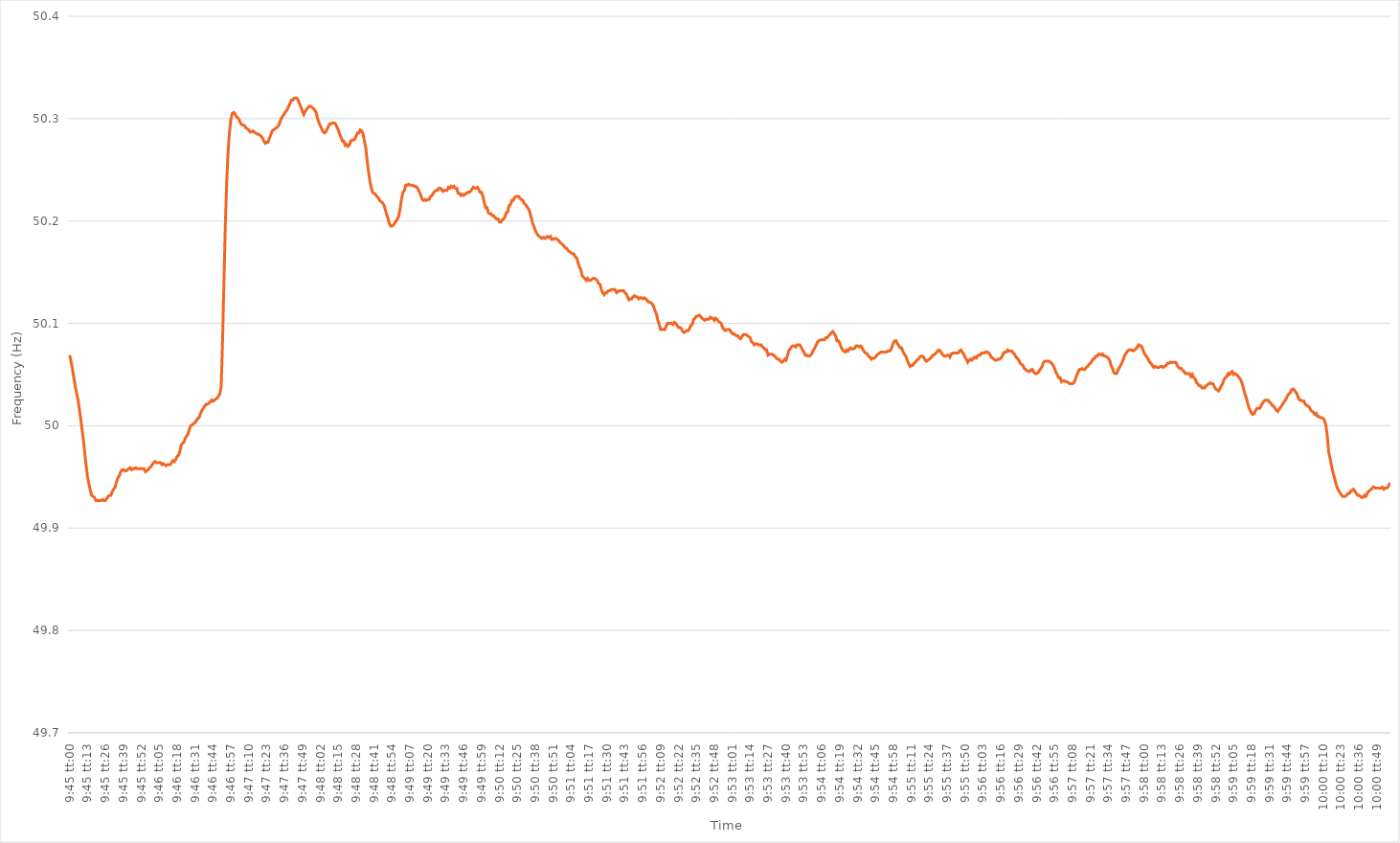
| Category | Series 0 |
|---|---|
| 0.40625 | 50.069 |
| 0.40626157407407404 | 50.063 |
| 0.40627314814814813 | 50.056 |
| 0.40628472222222217 | 50.047 |
| 0.4062962962962963 | 50.039 |
| 0.40630787037037036 | 50.032 |
| 0.40631944444444446 | 50.026 |
| 0.4063310185185185 | 50.017 |
| 0.4063425925925926 | 50.007 |
| 0.4063541666666666 | 49.997 |
| 0.4063657407407408 | 49.986 |
| 0.4063773148148148 | 49.973 |
| 0.4063888888888889 | 49.961 |
| 0.40640046296296295 | 49.95 |
| 0.40641203703703704 | 49.943 |
| 0.4064236111111111 | 49.937 |
| 0.40643518518518523 | 49.932 |
| 0.40644675925925927 | 49.931 |
| 0.40645833333333337 | 49.93 |
| 0.4064699074074074 | 49.927 |
| 0.4064814814814815 | 49.927 |
| 0.40649305555555554 | 49.927 |
| 0.4065046296296296 | 49.927 |
| 0.4065162037037037 | 49.927 |
| 0.40652777777777777 | 49.928 |
| 0.40653935185185186 | 49.927 |
| 0.4065509259259259 | 49.927 |
| 0.4065625 | 49.929 |
| 0.40657407407407403 | 49.931 |
| 0.4065856481481482 | 49.932 |
| 0.4065972222222222 | 49.932 |
| 0.4066087962962963 | 49.936 |
| 0.40662037037037035 | 49.938 |
| 0.40663194444444445 | 49.94 |
| 0.4066435185185185 | 49.945 |
| 0.40665509259259264 | 49.949 |
| 0.4066666666666667 | 49.951 |
| 0.40667824074074077 | 49.955 |
| 0.4066898148148148 | 49.957 |
| 0.4067013888888889 | 49.957 |
| 0.40671296296296294 | 49.956 |
| 0.406724537037037 | 49.956 |
| 0.40673611111111113 | 49.957 |
| 0.40674768518518517 | 49.958 |
| 0.40675925925925926 | 49.959 |
| 0.4067708333333333 | 49.957 |
| 0.4067824074074074 | 49.958 |
| 0.40679398148148144 | 49.958 |
| 0.4068055555555556 | 49.959 |
| 0.4068171296296296 | 49.958 |
| 0.4068287037037037 | 49.958 |
| 0.40684027777777776 | 49.958 |
| 0.40685185185185185 | 49.958 |
| 0.4068634259259259 | 49.958 |
| 0.40687500000000004 | 49.958 |
| 0.4068865740740741 | 49.955 |
| 0.4068981481481482 | 49.956 |
| 0.4069097222222222 | 49.957 |
| 0.4069212962962963 | 49.959 |
| 0.40693287037037035 | 49.96 |
| 0.4069444444444445 | 49.962 |
| 0.40695601851851854 | 49.964 |
| 0.4069675925925926 | 49.965 |
| 0.40697916666666667 | 49.964 |
| 0.4069907407407407 | 49.964 |
| 0.4070023148148148 | 49.964 |
| 0.40701388888888884 | 49.964 |
| 0.407025462962963 | 49.962 |
| 0.40703703703703703 | 49.963 |
| 0.4070486111111111 | 49.962 |
| 0.40706018518518516 | 49.961 |
| 0.40707175925925926 | 49.962 |
| 0.4070833333333333 | 49.962 |
| 0.40709490740740745 | 49.962 |
| 0.4071064814814815 | 49.964 |
| 0.4071180555555556 | 49.966 |
| 0.4071296296296296 | 49.965 |
| 0.4071412037037037 | 49.967 |
| 0.40715277777777775 | 49.97 |
| 0.4071643518518519 | 49.971 |
| 0.40717592592592594 | 49.975 |
| 0.40718750000000004 | 49.981 |
| 0.4071990740740741 | 49.983 |
| 0.4072106481481481 | 49.984 |
| 0.4072222222222222 | 49.988 |
| 0.40723379629629625 | 49.99 |
| 0.4072453703703704 | 49.992 |
| 0.40725694444444444 | 49.997 |
| 0.40726851851851853 | 50 |
| 0.40728009259259257 | 50.001 |
| 0.40729166666666666 | 50.002 |
| 0.4073032407407407 | 50.003 |
| 0.40731481481481485 | 50.005 |
| 0.4073263888888889 | 50.007 |
| 0.407337962962963 | 50.008 |
| 0.407349537037037 | 50.012 |
| 0.4073611111111111 | 50.015 |
| 0.40737268518518516 | 50.017 |
| 0.4073842592592593 | 50.019 |
| 0.40739583333333335 | 50.021 |
| 0.40740740740740744 | 50.021 |
| 0.4074189814814815 | 50.022 |
| 0.4074305555555556 | 50.023 |
| 0.4074421296296296 | 50.025 |
| 0.40745370370370365 | 50.024 |
| 0.4074652777777778 | 50.025 |
| 0.40747685185185184 | 50.026 |
| 0.40748842592592593 | 50.027 |
| 0.4075 | 50.029 |
| 0.40751157407407407 | 50.031 |
| 0.4075231481481481 | 50.038 |
| 0.40753472222222226 | 50.082 |
| 0.4075462962962963 | 50.14 |
| 0.4075578703703704 | 50.195 |
| 0.40756944444444443 | 50.237 |
| 0.4075810185185185 | 50.267 |
| 0.40759259259259256 | 50.286 |
| 0.4076041666666667 | 50.299 |
| 0.40761574074074075 | 50.305 |
| 0.40762731481481485 | 50.306 |
| 0.4076388888888889 | 50.305 |
| 0.407650462962963 | 50.302 |
| 0.407662037037037 | 50.301 |
| 0.40767361111111106 | 50.299 |
| 0.4076851851851852 | 50.296 |
| 0.40769675925925924 | 50.294 |
| 0.40770833333333334 | 50.294 |
| 0.4077199074074074 | 50.293 |
| 0.4077314814814815 | 50.291 |
| 0.4077430555555555 | 50.29 |
| 0.40775462962962966 | 50.289 |
| 0.4077662037037037 | 50.287 |
| 0.4077777777777778 | 50.287 |
| 0.40778935185185183 | 50.288 |
| 0.40780092592592593 | 50.287 |
| 0.40781249999999997 | 50.286 |
| 0.4078240740740741 | 50.285 |
| 0.40783564814814816 | 50.285 |
| 0.40784722222222225 | 50.284 |
| 0.4078587962962963 | 50.283 |
| 0.4078703703703704 | 50.281 |
| 0.4078819444444444 | 50.278 |
| 0.40789351851851857 | 50.276 |
| 0.4079050925925926 | 50.277 |
| 0.40791666666666665 | 50.277 |
| 0.40792824074074074 | 50.281 |
| 0.4079398148148148 | 50.284 |
| 0.4079513888888889 | 50.288 |
| 0.4079629629629629 | 50.289 |
| 0.40797453703703707 | 50.29 |
| 0.4079861111111111 | 50.291 |
| 0.4079976851851852 | 50.292 |
| 0.40800925925925924 | 50.294 |
| 0.40802083333333333 | 50.298 |
| 0.40803240740740737 | 50.301 |
| 0.4080439814814815 | 50.303 |
| 0.40805555555555556 | 50.305 |
| 0.40806712962962965 | 50.307 |
| 0.4080787037037037 | 50.309 |
| 0.4080902777777778 | 50.312 |
| 0.4081018518518518 | 50.315 |
| 0.408113425925926 | 50.318 |
| 0.408125 | 50.318 |
| 0.4081365740740741 | 50.32 |
| 0.40814814814814815 | 50.32 |
| 0.4081597222222222 | 50.32 |
| 0.4081712962962963 | 50.318 |
| 0.4081828703703703 | 50.314 |
| 0.40819444444444447 | 50.311 |
| 0.4082060185185185 | 50.307 |
| 0.4082175925925926 | 50.304 |
| 0.40822916666666664 | 50.307 |
| 0.40824074074074074 | 50.309 |
| 0.4082523148148148 | 50.311 |
| 0.4082638888888889 | 50.312 |
| 0.40827546296296297 | 50.312 |
| 0.40828703703703706 | 50.311 |
| 0.4082986111111111 | 50.31 |
| 0.4083101851851852 | 50.308 |
| 0.40832175925925923 | 50.306 |
| 0.4083333333333334 | 50.3 |
| 0.4083449074074074 | 50.296 |
| 0.4083564814814815 | 50.293 |
| 0.40836805555555555 | 50.29 |
| 0.40837962962962965 | 50.287 |
| 0.4083912037037037 | 50.286 |
| 0.4084027777777777 | 50.287 |
| 0.4084143518518519 | 50.29 |
| 0.4084259259259259 | 50.293 |
| 0.4084375 | 50.295 |
| 0.40844907407407405 | 50.295 |
| 0.40846064814814814 | 50.296 |
| 0.4084722222222222 | 50.296 |
| 0.40848379629629633 | 50.295 |
| 0.40849537037037037 | 50.292 |
| 0.40850694444444446 | 50.289 |
| 0.4085185185185185 | 50.285 |
| 0.4085300925925926 | 50.282 |
| 0.40854166666666664 | 50.278 |
| 0.4085532407407408 | 50.278 |
| 0.4085648148148148 | 50.274 |
| 0.4085763888888889 | 50.275 |
| 0.40858796296296296 | 50.273 |
| 0.40859953703703705 | 50.274 |
| 0.4086111111111111 | 50.278 |
| 0.40862268518518513 | 50.279 |
| 0.4086342592592593 | 50.279 |
| 0.4086458333333333 | 50.28 |
| 0.4086574074074074 | 50.283 |
| 0.40866898148148145 | 50.286 |
| 0.40868055555555555 | 50.286 |
| 0.4086921296296296 | 50.289 |
| 0.40870370370370374 | 50.288 |
| 0.4087152777777778 | 50.285 |
| 0.40872685185185187 | 50.278 |
| 0.4087384259259259 | 50.271 |
| 0.40875 | 50.259 |
| 0.40876157407407404 | 50.248 |
| 0.4087731481481482 | 50.239 |
| 0.40878472222222223 | 50.232 |
| 0.4087962962962963 | 50.228 |
| 0.40880787037037036 | 50.227 |
| 0.40881944444444446 | 50.226 |
| 0.4088310185185185 | 50.224 |
| 0.40884259259259265 | 50.223 |
| 0.4088541666666667 | 50.22 |
| 0.4088657407407407 | 50.219 |
| 0.4088773148148148 | 50.218 |
| 0.40888888888888886 | 50.216 |
| 0.40890046296296295 | 50.212 |
| 0.408912037037037 | 50.207 |
| 0.40892361111111114 | 50.203 |
| 0.4089351851851852 | 50.198 |
| 0.4089467592592593 | 50.195 |
| 0.4089583333333333 | 50.195 |
| 0.4089699074074074 | 50.196 |
| 0.40898148148148145 | 50.198 |
| 0.4089930555555556 | 50.2 |
| 0.40900462962962963 | 50.202 |
| 0.40901620370370373 | 50.205 |
| 0.40902777777777777 | 50.213 |
| 0.40903935185185186 | 50.222 |
| 0.4090509259259259 | 50.228 |
| 0.40906250000000005 | 50.23 |
| 0.4090740740740741 | 50.235 |
| 0.4090856481481482 | 50.235 |
| 0.4090972222222222 | 50.236 |
| 0.40910879629629626 | 50.235 |
| 0.40912037037037036 | 50.235 |
| 0.4091319444444444 | 50.235 |
| 0.40914351851851855 | 50.234 |
| 0.4091550925925926 | 50.234 |
| 0.4091666666666667 | 50.233 |
| 0.4091782407407407 | 50.231 |
| 0.4091898148148148 | 50.228 |
| 0.40920138888888885 | 50.225 |
| 0.409212962962963 | 50.221 |
| 0.40922453703703704 | 50.22 |
| 0.40923611111111113 | 50.221 |
| 0.4092476851851852 | 50.22 |
| 0.40925925925925927 | 50.221 |
| 0.4092708333333333 | 50.221 |
| 0.40928240740740746 | 50.224 |
| 0.4092939814814815 | 50.225 |
| 0.4093055555555556 | 50.227 |
| 0.40931712962962963 | 50.229 |
| 0.40932870370370367 | 50.23 |
| 0.40934027777777776 | 50.23 |
| 0.4093518518518518 | 50.232 |
| 0.40936342592592595 | 50.232 |
| 0.409375 | 50.231 |
| 0.4093865740740741 | 50.229 |
| 0.4093981481481481 | 50.23 |
| 0.4094097222222222 | 50.23 |
| 0.40942129629629626 | 50.23 |
| 0.4094328703703704 | 50.233 |
| 0.40944444444444444 | 50.232 |
| 0.40945601851851854 | 50.234 |
| 0.4094675925925926 | 50.233 |
| 0.40947916666666667 | 50.234 |
| 0.4094907407407407 | 50.232 |
| 0.40950231481481486 | 50.232 |
| 0.4095138888888889 | 50.227 |
| 0.409525462962963 | 50.227 |
| 0.40953703703703703 | 50.225 |
| 0.4095486111111111 | 50.226 |
| 0.40956018518518517 | 50.225 |
| 0.4095717592592592 | 50.226 |
| 0.40958333333333335 | 50.227 |
| 0.4095949074074074 | 50.228 |
| 0.4096064814814815 | 50.228 |
| 0.4096180555555555 | 50.229 |
| 0.4096296296296296 | 50.231 |
| 0.40964120370370366 | 50.233 |
| 0.4096527777777778 | 50.232 |
| 0.40966435185185185 | 50.232 |
| 0.40967592592592594 | 50.233 |
| 0.4096875 | 50.231 |
| 0.4096990740740741 | 50.228 |
| 0.4097106481481481 | 50.228 |
| 0.40972222222222227 | 50.224 |
| 0.4097337962962963 | 50.218 |
| 0.4097453703703704 | 50.213 |
| 0.40975694444444444 | 50.213 |
| 0.40976851851851853 | 50.208 |
| 0.40978009259259257 | 50.207 |
| 0.4097916666666667 | 50.207 |
| 0.40980324074074076 | 50.205 |
| 0.4098148148148148 | 50.205 |
| 0.4098263888888889 | 50.203 |
| 0.40983796296296293 | 50.202 |
| 0.409849537037037 | 50.202 |
| 0.40986111111111106 | 50.199 |
| 0.4098726851851852 | 50.199 |
| 0.40988425925925925 | 50.201 |
| 0.40989583333333335 | 50.202 |
| 0.4099074074074074 | 50.204 |
| 0.4099189814814815 | 50.208 |
| 0.4099305555555555 | 50.209 |
| 0.40994212962962967 | 50.215 |
| 0.4099537037037037 | 50.216 |
| 0.4099652777777778 | 50.22 |
| 0.40997685185185184 | 50.22 |
| 0.40998842592592594 | 50.223 |
| 0.41 | 50.224 |
| 0.4100115740740741 | 50.224 |
| 0.41002314814814816 | 50.224 |
| 0.41003472222222226 | 50.222 |
| 0.4100462962962963 | 50.221 |
| 0.41005787037037034 | 50.22 |
| 0.41006944444444443 | 50.217 |
| 0.41008101851851847 | 50.216 |
| 0.4100925925925926 | 50.214 |
| 0.41010416666666666 | 50.212 |
| 0.41011574074074075 | 50.209 |
| 0.4101273148148148 | 50.204 |
| 0.4101388888888889 | 50.198 |
| 0.4101504629629629 | 50.195 |
| 0.4101620370370371 | 50.191 |
| 0.4101736111111111 | 50.188 |
| 0.4101851851851852 | 50.186 |
| 0.41019675925925925 | 50.185 |
| 0.41020833333333334 | 50.184 |
| 0.4102199074074074 | 50.183 |
| 0.41023148148148153 | 50.184 |
| 0.41024305555555557 | 50.183 |
| 0.41025462962962966 | 50.184 |
| 0.4102662037037037 | 50.185 |
| 0.41027777777777774 | 50.184 |
| 0.41028935185185184 | 50.185 |
| 0.4103009259259259 | 50.182 |
| 0.4103125 | 50.182 |
| 0.41032407407407406 | 50.183 |
| 0.41033564814814816 | 50.183 |
| 0.4103472222222222 | 50.182 |
| 0.4103587962962963 | 50.181 |
| 0.41037037037037033 | 50.179 |
| 0.4103819444444445 | 50.178 |
| 0.4103935185185185 | 50.177 |
| 0.4104050925925926 | 50.175 |
| 0.41041666666666665 | 50.174 |
| 0.41042824074074075 | 50.173 |
| 0.4104398148148148 | 50.171 |
| 0.41045138888888894 | 50.17 |
| 0.410462962962963 | 50.169 |
| 0.41047453703703707 | 50.168 |
| 0.4104861111111111 | 50.168 |
| 0.4104976851851852 | 50.165 |
| 0.41050925925925924 | 50.164 |
| 0.4105208333333333 | 50.16 |
| 0.41053240740740743 | 50.155 |
| 0.41054398148148147 | 50.153 |
| 0.41055555555555556 | 50.147 |
| 0.4105671296296296 | 50.145 |
| 0.4105787037037037 | 50.144 |
| 0.41059027777777773 | 50.142 |
| 0.4106018518518519 | 50.144 |
| 0.4106134259259259 | 50.142 |
| 0.410625 | 50.142 |
| 0.41063657407407406 | 50.143 |
| 0.41064814814814815 | 50.144 |
| 0.4106597222222222 | 50.144 |
| 0.41067129629629634 | 50.143 |
| 0.4106828703703704 | 50.142 |
| 0.4106944444444445 | 50.139 |
| 0.4107060185185185 | 50.138 |
| 0.4107175925925926 | 50.133 |
| 0.41072916666666665 | 50.13 |
| 0.4107407407407408 | 50.128 |
| 0.41075231481481483 | 50.13 |
| 0.4107638888888889 | 50.13 |
| 0.41077546296296297 | 50.132 |
| 0.410787037037037 | 50.132 |
| 0.4107986111111111 | 50.133 |
| 0.41081018518518514 | 50.133 |
| 0.4108217592592593 | 50.133 |
| 0.41083333333333333 | 50.133 |
| 0.4108449074074074 | 50.13 |
| 0.41085648148148146 | 50.131 |
| 0.41086805555555556 | 50.132 |
| 0.4108796296296296 | 50.132 |
| 0.41089120370370374 | 50.132 |
| 0.4109027777777778 | 50.132 |
| 0.4109143518518519 | 50.13 |
| 0.4109259259259259 | 50.129 |
| 0.4109375 | 50.126 |
| 0.41094907407407405 | 50.123 |
| 0.4109606481481482 | 50.124 |
| 0.41097222222222224 | 50.124 |
| 0.41098379629629633 | 50.126 |
| 0.41099537037037037 | 50.127 |
| 0.4110069444444444 | 50.126 |
| 0.4110185185185185 | 50.126 |
| 0.41103009259259254 | 50.124 |
| 0.4110416666666667 | 50.125 |
| 0.41105324074074073 | 50.125 |
| 0.4110648148148148 | 50.124 |
| 0.41107638888888887 | 50.125 |
| 0.41108796296296296 | 50.124 |
| 0.411099537037037 | 50.123 |
| 0.41111111111111115 | 50.121 |
| 0.4111226851851852 | 50.121 |
| 0.4111342592592593 | 50.12 |
| 0.4111458333333333 | 50.119 |
| 0.4111574074074074 | 50.116 |
| 0.41116898148148145 | 50.112 |
| 0.4111805555555556 | 50.109 |
| 0.41119212962962964 | 50.103 |
| 0.41120370370370374 | 50.099 |
| 0.4112152777777778 | 50.094 |
| 0.4112268518518518 | 50.094 |
| 0.4112384259259259 | 50.094 |
| 0.41124999999999995 | 50.094 |
| 0.4112615740740741 | 50.097 |
| 0.41127314814814814 | 50.1 |
| 0.41128472222222223 | 50.1 |
| 0.41129629629629627 | 50.1 |
| 0.41130787037037037 | 50.1 |
| 0.4113194444444444 | 50.099 |
| 0.41133101851851855 | 50.101 |
| 0.4113425925925926 | 50.1 |
| 0.4113541666666667 | 50.098 |
| 0.4113657407407407 | 50.096 |
| 0.4113773148148148 | 50.096 |
| 0.41138888888888886 | 50.095 |
| 0.411400462962963 | 50.092 |
| 0.41141203703703705 | 50.091 |
| 0.41142361111111114 | 50.092 |
| 0.4114351851851852 | 50.093 |
| 0.4114467592592593 | 50.093 |
| 0.4114583333333333 | 50.095 |
| 0.41146990740740735 | 50.098 |
| 0.4114814814814815 | 50.099 |
| 0.41149305555555554 | 50.104 |
| 0.41150462962962964 | 50.105 |
| 0.4115162037037037 | 50.107 |
| 0.41152777777777777 | 50.107 |
| 0.4115393518518518 | 50.108 |
| 0.41155092592592596 | 50.107 |
| 0.4115625 | 50.105 |
| 0.4115740740740741 | 50.104 |
| 0.41158564814814813 | 50.103 |
| 0.4115972222222222 | 50.104 |
| 0.41160879629629626 | 50.104 |
| 0.4116203703703704 | 50.104 |
| 0.41163194444444445 | 50.106 |
| 0.41164351851851855 | 50.105 |
| 0.4116550925925926 | 50.105 |
| 0.4116666666666667 | 50.103 |
| 0.4116782407407407 | 50.105 |
| 0.41168981481481487 | 50.104 |
| 0.4117013888888889 | 50.102 |
| 0.41171296296296295 | 50.101 |
| 0.41172453703703704 | 50.1 |
| 0.4117361111111111 | 50.096 |
| 0.4117476851851852 | 50.094 |
| 0.4117592592592592 | 50.093 |
| 0.41177083333333336 | 50.094 |
| 0.4117824074074074 | 50.094 |
| 0.4117939814814815 | 50.094 |
| 0.41180555555555554 | 50.092 |
| 0.41181712962962963 | 50.09 |
| 0.41182870370370367 | 50.09 |
| 0.4118402777777778 | 50.089 |
| 0.41185185185185186 | 50.088 |
| 0.41186342592592595 | 50.088 |
| 0.411875 | 50.086 |
| 0.4118865740740741 | 50.085 |
| 0.4118981481481481 | 50.087 |
| 0.4119097222222223 | 50.089 |
| 0.4119212962962963 | 50.089 |
| 0.41193287037037035 | 50.089 |
| 0.41194444444444445 | 50.088 |
| 0.4119560185185185 | 50.087 |
| 0.4119675925925926 | 50.086 |
| 0.4119791666666666 | 50.082 |
| 0.41199074074074077 | 50.081 |
| 0.4120023148148148 | 50.079 |
| 0.4120138888888889 | 50.08 |
| 0.41202546296296294 | 50.08 |
| 0.41203703703703703 | 50.079 |
| 0.4120486111111111 | 50.079 |
| 0.4120601851851852 | 50.079 |
| 0.41207175925925926 | 50.077 |
| 0.41208333333333336 | 50.076 |
| 0.4120949074074074 | 50.074 |
| 0.4121064814814815 | 50.074 |
| 0.41211805555555553 | 50.069 |
| 0.4121296296296297 | 50.07 |
| 0.4121412037037037 | 50.07 |
| 0.4121527777777778 | 50.07 |
| 0.41216435185185185 | 50.069 |
| 0.4121759259259259 | 50.068 |
| 0.4121875 | 50.066 |
| 0.412199074074074 | 50.065 |
| 0.4122106481481482 | 50.065 |
| 0.4122222222222222 | 50.063 |
| 0.4122337962962963 | 50.062 |
| 0.41224537037037035 | 50.063 |
| 0.41225694444444444 | 50.065 |
| 0.4122685185185185 | 50.064 |
| 0.41228009259259263 | 50.068 |
| 0.41229166666666667 | 50.073 |
| 0.41230324074074076 | 50.075 |
| 0.4123148148148148 | 50.077 |
| 0.4123263888888889 | 50.078 |
| 0.41233796296296293 | 50.078 |
| 0.4123495370370371 | 50.077 |
| 0.4123611111111111 | 50.079 |
| 0.4123726851851852 | 50.079 |
| 0.41238425925925926 | 50.079 |
| 0.41239583333333335 | 50.077 |
| 0.4124074074074074 | 50.074 |
| 0.41241898148148143 | 50.072 |
| 0.4124305555555556 | 50.069 |
| 0.4124421296296296 | 50.069 |
| 0.4124537037037037 | 50.068 |
| 0.41246527777777775 | 50.068 |
| 0.41247685185185184 | 50.069 |
| 0.4124884259259259 | 50.071 |
| 0.41250000000000003 | 50.074 |
| 0.41251157407407407 | 50.076 |
| 0.41252314814814817 | 50.079 |
| 0.4125347222222222 | 50.082 |
| 0.4125462962962963 | 50.083 |
| 0.41255787037037034 | 50.084 |
| 0.4125694444444445 | 50.084 |
| 0.4125810185185185 | 50.084 |
| 0.4125925925925926 | 50.084 |
| 0.41260416666666666 | 50.086 |
| 0.41261574074074076 | 50.086 |
| 0.4126273148148148 | 50.088 |
| 0.41263888888888894 | 50.089 |
| 0.412650462962963 | 50.091 |
| 0.412662037037037 | 50.092 |
| 0.4126736111111111 | 50.09 |
| 0.41268518518518515 | 50.088 |
| 0.41269675925925925 | 50.083 |
| 0.4127083333333333 | 50.083 |
| 0.41271990740740744 | 50.081 |
| 0.4127314814814815 | 50.077 |
| 0.41274305555555557 | 50.074 |
| 0.4127546296296296 | 50.073 |
| 0.4127662037037037 | 50.072 |
| 0.41277777777777774 | 50.074 |
| 0.4127893518518519 | 50.073 |
| 0.41280092592592593 | 50.075 |
| 0.4128125 | 50.076 |
| 0.41282407407407407 | 50.075 |
| 0.41283564814814816 | 50.075 |
| 0.4128472222222222 | 50.076 |
| 0.41285879629629635 | 50.078 |
| 0.4128703703703704 | 50.078 |
| 0.4128819444444444 | 50.077 |
| 0.4128935185185185 | 50.078 |
| 0.41290509259259256 | 50.077 |
| 0.41291666666666665 | 50.074 |
| 0.4129282407407407 | 50.072 |
| 0.41293981481481484 | 50.071 |
| 0.4129513888888889 | 50.07 |
| 0.412962962962963 | 50.068 |
| 0.412974537037037 | 50.067 |
| 0.4129861111111111 | 50.065 |
| 0.41299768518518515 | 50.066 |
| 0.4130092592592593 | 50.066 |
| 0.41302083333333334 | 50.067 |
| 0.41303240740740743 | 50.069 |
| 0.41304398148148147 | 50.07 |
| 0.41305555555555556 | 50.071 |
| 0.4130671296296296 | 50.072 |
| 0.41307870370370375 | 50.072 |
| 0.4130902777777778 | 50.072 |
| 0.4131018518518519 | 50.072 |
| 0.4131134259259259 | 50.072 |
| 0.41312499999999996 | 50.073 |
| 0.41313657407407406 | 50.073 |
| 0.4131481481481481 | 50.074 |
| 0.41315972222222225 | 50.077 |
| 0.4131712962962963 | 50.081 |
| 0.4131828703703704 | 50.083 |
| 0.4131944444444444 | 50.083 |
| 0.4132060185185185 | 50.08 |
| 0.41321759259259255 | 50.078 |
| 0.4132291666666667 | 50.076 |
| 0.41324074074074074 | 50.076 |
| 0.41325231481481484 | 50.072 |
| 0.4132638888888889 | 50.07 |
| 0.41327546296296297 | 50.068 |
| 0.413287037037037 | 50.064 |
| 0.41329861111111116 | 50.061 |
| 0.4133101851851852 | 50.058 |
| 0.4133217592592593 | 50.059 |
| 0.41333333333333333 | 50.059 |
| 0.4133449074074074 | 50.061 |
| 0.41335648148148146 | 50.062 |
| 0.4133680555555555 | 50.064 |
| 0.41337962962962965 | 50.065 |
| 0.4133912037037037 | 50.067 |
| 0.4134027777777778 | 50.068 |
| 0.4134143518518518 | 50.068 |
| 0.4134259259259259 | 50.067 |
| 0.41343749999999996 | 50.064 |
| 0.4134490740740741 | 50.063 |
| 0.41346064814814815 | 50.064 |
| 0.41347222222222224 | 50.065 |
| 0.4134837962962963 | 50.066 |
| 0.4134953703703704 | 50.068 |
| 0.4135069444444444 | 50.069 |
| 0.41351851851851856 | 50.07 |
| 0.4135300925925926 | 50.071 |
| 0.4135416666666667 | 50.073 |
| 0.41355324074074074 | 50.074 |
| 0.41356481481481483 | 50.073 |
| 0.41357638888888887 | 50.071 |
| 0.413587962962963 | 50.069 |
| 0.41359953703703706 | 50.068 |
| 0.4136111111111111 | 50.068 |
| 0.4136226851851852 | 50.069 |
| 0.41363425925925923 | 50.069 |
| 0.4136458333333333 | 50.067 |
| 0.41365740740740736 | 50.07 |
| 0.4136689814814815 | 50.071 |
| 0.41368055555555555 | 50.071 |
| 0.41369212962962965 | 50.071 |
| 0.4137037037037037 | 50.071 |
| 0.4137152777777778 | 50.071 |
| 0.4137268518518518 | 50.073 |
| 0.41373842592592597 | 50.074 |
| 0.41375 | 50.072 |
| 0.4137615740740741 | 50.07 |
| 0.41377314814814814 | 50.067 |
| 0.41378472222222223 | 50.065 |
| 0.4137962962962963 | 50.062 |
| 0.4138078703703704 | 50.064 |
| 0.41381944444444446 | 50.065 |
| 0.4138310185185185 | 50.064 |
| 0.4138425925925926 | 50.066 |
| 0.41385416666666663 | 50.067 |
| 0.41386574074074073 | 50.066 |
| 0.41387731481481477 | 50.068 |
| 0.4138888888888889 | 50.069 |
| 0.41390046296296296 | 50.069 |
| 0.41391203703703705 | 50.071 |
| 0.4139236111111111 | 50.071 |
| 0.4139351851851852 | 50.071 |
| 0.4139467592592592 | 50.072 |
| 0.4139583333333334 | 50.072 |
| 0.4139699074074074 | 50.071 |
| 0.4139814814814815 | 50.07 |
| 0.41399305555555554 | 50.067 |
| 0.41400462962962964 | 50.066 |
| 0.4140162037037037 | 50.065 |
| 0.41402777777777783 | 50.064 |
| 0.41403935185185187 | 50.064 |
| 0.41405092592592596 | 50.065 |
| 0.4140625 | 50.065 |
| 0.41407407407407404 | 50.066 |
| 0.41408564814814813 | 50.068 |
| 0.41409722222222217 | 50.071 |
| 0.4141087962962963 | 50.072 |
| 0.41412037037037036 | 50.072 |
| 0.41413194444444446 | 50.074 |
| 0.4141435185185185 | 50.073 |
| 0.4141550925925926 | 50.073 |
| 0.4141666666666666 | 50.073 |
| 0.4141782407407408 | 50.071 |
| 0.4141898148148148 | 50.07 |
| 0.4142013888888889 | 50.067 |
| 0.41421296296296295 | 50.066 |
| 0.41422453703703704 | 50.064 |
| 0.4142361111111111 | 50.061 |
| 0.41424768518518523 | 50.06 |
| 0.41425925925925927 | 50.059 |
| 0.41427083333333337 | 50.056 |
| 0.4142824074074074 | 50.055 |
| 0.4142939814814815 | 50.054 |
| 0.41430555555555554 | 50.053 |
| 0.4143171296296296 | 50.053 |
| 0.4143287037037037 | 50.055 |
| 0.41434027777777777 | 50.055 |
| 0.41435185185185186 | 50.052 |
| 0.4143634259259259 | 50.051 |
| 0.414375 | 50.051 |
| 0.41438657407407403 | 50.052 |
| 0.4143981481481482 | 50.054 |
| 0.4144097222222222 | 50.056 |
| 0.4144212962962963 | 50.058 |
| 0.41443287037037035 | 50.062 |
| 0.41444444444444445 | 50.063 |
| 0.4144560185185185 | 50.063 |
| 0.41446759259259264 | 50.063 |
| 0.4144791666666667 | 50.063 |
| 0.41449074074074077 | 50.062 |
| 0.4145023148148148 | 50.061 |
| 0.4145138888888889 | 50.059 |
| 0.41452546296296294 | 50.056 |
| 0.414537037037037 | 50.052 |
| 0.41454861111111113 | 50.05 |
| 0.41456018518518517 | 50.047 |
| 0.41457175925925926 | 50.047 |
| 0.4145833333333333 | 50.043 |
| 0.4145949074074074 | 50.044 |
| 0.41460648148148144 | 50.044 |
| 0.4146180555555556 | 50.043 |
| 0.4146296296296296 | 50.043 |
| 0.4146412037037037 | 50.042 |
| 0.41465277777777776 | 50.041 |
| 0.41466435185185185 | 50.041 |
| 0.4146759259259259 | 50.041 |
| 0.41468750000000004 | 50.042 |
| 0.4146990740740741 | 50.045 |
| 0.4147106481481482 | 50.049 |
| 0.4147222222222222 | 50.052 |
| 0.4147337962962963 | 50.055 |
| 0.41474537037037035 | 50.055 |
| 0.4147569444444445 | 50.056 |
| 0.41476851851851854 | 50.055 |
| 0.4147800925925926 | 50.055 |
| 0.41479166666666667 | 50.057 |
| 0.4148032407407407 | 50.058 |
| 0.4148148148148148 | 50.06 |
| 0.41482638888888884 | 50.061 |
| 0.414837962962963 | 50.063 |
| 0.41484953703703703 | 50.065 |
| 0.4148611111111111 | 50.066 |
| 0.41487268518518516 | 50.068 |
| 0.41488425925925926 | 50.068 |
| 0.4148958333333333 | 50.07 |
| 0.41490740740740745 | 50.07 |
| 0.4149189814814815 | 50.069 |
| 0.4149305555555556 | 50.07 |
| 0.4149421296296296 | 50.068 |
| 0.4149537037037037 | 50.068 |
| 0.41496527777777775 | 50.067 |
| 0.4149768518518519 | 50.066 |
| 0.41498842592592594 | 50.064 |
| 0.41500000000000004 | 50.059 |
| 0.4150115740740741 | 50.056 |
| 0.4150231481481481 | 50.052 |
| 0.4150347222222222 | 50.051 |
| 0.41504629629629625 | 50.051 |
| 0.4150578703703704 | 50.054 |
| 0.41506944444444444 | 50.057 |
| 0.41508101851851853 | 50.059 |
| 0.41509259259259257 | 50.062 |
| 0.41510416666666666 | 50.065 |
| 0.4151157407407407 | 50.069 |
| 0.41512731481481485 | 50.071 |
| 0.4151388888888889 | 50.073 |
| 0.415150462962963 | 50.074 |
| 0.415162037037037 | 50.074 |
| 0.4151736111111111 | 50.074 |
| 0.41518518518518516 | 50.073 |
| 0.4151967592592593 | 50.074 |
| 0.41520833333333335 | 50.075 |
| 0.41521990740740744 | 50.077 |
| 0.4152314814814815 | 50.079 |
| 0.4152430555555556 | 50.078 |
| 0.4152546296296296 | 50.078 |
| 0.41526620370370365 | 50.075 |
| 0.4152777777777778 | 50.071 |
| 0.41528935185185184 | 50.069 |
| 0.41530092592592593 | 50.067 |
| 0.4153125 | 50.065 |
| 0.41532407407407407 | 50.062 |
| 0.4153356481481481 | 50.061 |
| 0.41534722222222226 | 50.059 |
| 0.4153587962962963 | 50.057 |
| 0.4153703703703704 | 50.058 |
| 0.41538194444444443 | 50.057 |
| 0.4153935185185185 | 50.057 |
| 0.41540509259259256 | 50.057 |
| 0.4154166666666667 | 50.058 |
| 0.41542824074074075 | 50.058 |
| 0.41543981481481485 | 50.057 |
| 0.4154513888888889 | 50.058 |
| 0.415462962962963 | 50.059 |
| 0.415474537037037 | 50.061 |
| 0.41548611111111106 | 50.061 |
| 0.4154976851851852 | 50.062 |
| 0.41550925925925924 | 50.062 |
| 0.41552083333333334 | 50.062 |
| 0.4155324074074074 | 50.062 |
| 0.4155439814814815 | 50.062 |
| 0.4155555555555555 | 50.059 |
| 0.41556712962962966 | 50.057 |
| 0.4155787037037037 | 50.056 |
| 0.4155902777777778 | 50.056 |
| 0.41560185185185183 | 50.054 |
| 0.41561342592592593 | 50.053 |
| 0.41562499999999997 | 50.051 |
| 0.4156365740740741 | 50.051 |
| 0.41564814814814816 | 50.051 |
| 0.41565972222222225 | 50.051 |
| 0.4156712962962963 | 50.048 |
| 0.4156828703703704 | 50.05 |
| 0.4156944444444444 | 50.047 |
| 0.41570601851851857 | 50.046 |
| 0.4157175925925926 | 50.042 |
| 0.41572916666666665 | 50.041 |
| 0.41574074074074074 | 50.039 |
| 0.4157523148148148 | 50.039 |
| 0.4157638888888889 | 50.037 |
| 0.4157754629629629 | 50.037 |
| 0.41578703703703707 | 50.037 |
| 0.4157986111111111 | 50.039 |
| 0.4158101851851852 | 50.04 |
| 0.41582175925925924 | 50.041 |
| 0.41583333333333333 | 50.042 |
| 0.41584490740740737 | 50.041 |
| 0.4158564814814815 | 50.041 |
| 0.41586805555555556 | 50.038 |
| 0.41587962962962965 | 50.036 |
| 0.4158912037037037 | 50.035 |
| 0.4159027777777778 | 50.034 |
| 0.4159143518518518 | 50.036 |
| 0.415925925925926 | 50.039 |
| 0.4159375 | 50.041 |
| 0.4159490740740741 | 50.045 |
| 0.41596064814814815 | 50.047 |
| 0.4159722222222222 | 50.048 |
| 0.4159837962962963 | 50.051 |
| 0.4159953703703703 | 50.05 |
| 0.41600694444444447 | 50.052 |
| 0.4160185185185185 | 50.053 |
| 0.4160300925925926 | 50.05 |
| 0.41604166666666664 | 50.051 |
| 0.41605324074074074 | 50.05 |
| 0.4160648148148148 | 50.049 |
| 0.4160763888888889 | 50.047 |
| 0.41608796296296297 | 50.045 |
| 0.41609953703703706 | 50.042 |
| 0.4161111111111111 | 50.037 |
| 0.4161226851851852 | 50.032 |
| 0.41613425925925923 | 50.028 |
| 0.4161458333333334 | 50.023 |
| 0.4161574074074074 | 50.018 |
| 0.4161689814814815 | 50.015 |
| 0.41618055555555555 | 50.012 |
| 0.41619212962962965 | 50.011 |
| 0.4162037037037037 | 50.012 |
| 0.4162152777777777 | 50.015 |
| 0.4162268518518519 | 50.017 |
| 0.4162384259259259 | 50.017 |
| 0.41625 | 50.017 |
| 0.41626157407407405 | 50.02 |
| 0.41627314814814814 | 50.022 |
| 0.4162847222222222 | 50.024 |
| 0.41629629629629633 | 50.025 |
| 0.41630787037037037 | 50.025 |
| 0.41631944444444446 | 50.025 |
| 0.4163310185185185 | 50.023 |
| 0.4163425925925926 | 50.022 |
| 0.41635416666666664 | 50.02 |
| 0.4163657407407408 | 50.019 |
| 0.4163773148148148 | 50.017 |
| 0.4163888888888889 | 50.015 |
| 0.41640046296296296 | 50.014 |
| 0.41641203703703705 | 50.016 |
| 0.4164236111111111 | 50.018 |
| 0.41643518518518513 | 50.02 |
| 0.4164467592592593 | 50.022 |
| 0.4164583333333333 | 50.024 |
| 0.4164699074074074 | 50.026 |
| 0.41648148148148145 | 50.029 |
| 0.41649305555555555 | 50.031 |
| 0.4165046296296296 | 50.032 |
| 0.41651620370370374 | 50.035 |
| 0.4165277777777778 | 50.036 |
| 0.41653935185185187 | 50.035 |
| 0.4165509259259259 | 50.033 |
| 0.4165625 | 50.031 |
| 0.41657407407407404 | 50.027 |
| 0.4165856481481482 | 50.025 |
| 0.41659722222222223 | 50.025 |
| 0.4166087962962963 | 50.024 |
| 0.41662037037037036 | 50.024 |
| 0.41663194444444446 | 50.021 |
| 0.4166435185185185 | 50.02 |
| 0.41665509259259265 | 50.019 |
| 0.4166666666666667 | 50.018 |
| 0.4166782407407407 | 50.015 |
| 0.4166898148148148 | 50.014 |
| 0.41670138888888886 | 50.013 |
| 0.41671296296296295 | 50.011 |
| 0.416724537037037 | 50.012 |
| 0.41673611111111114 | 50.009 |
| 0.4167476851851852 | 50.009 |
| 0.4167592592592593 | 50.008 |
| 0.4167708333333333 | 50.008 |
| 0.4167824074074074 | 50.007 |
| 0.41679398148148145 | 50.005 |
| 0.4168055555555556 | 50 |
| 0.41681712962962963 | 49.99 |
| 0.41682870370370373 | 49.974 |
| 0.41684027777777777 | 49.968 |
| 0.41685185185185186 | 49.961 |
| 0.4168634259259259 | 49.955 |
| 0.41687500000000005 | 49.95 |
| 0.4168865740740741 | 49.945 |
| 0.4168981481481482 | 49.94 |
| 0.4169097222222222 | 49.937 |
| 0.41692129629629626 | 49.935 |
| 0.41693287037037036 | 49.933 |
| 0.4169444444444444 | 49.931 |
| 0.41695601851851855 | 49.931 |
| 0.4169675925925926 | 49.931 |
| 0.4169791666666667 | 49.932 |
| 0.4169907407407407 | 49.934 |
| 0.4170023148148148 | 49.934 |
| 0.41701388888888885 | 49.936 |
| 0.417025462962963 | 49.937 |
| 0.41703703703703704 | 49.938 |
| 0.41704861111111113 | 49.936 |
| 0.4170601851851852 | 49.934 |
| 0.41707175925925927 | 49.932 |
| 0.4170833333333333 | 49.932 |
| 0.41709490740740746 | 49.931 |
| 0.4171064814814815 | 49.93 |
| 0.4171180555555556 | 49.93 |
| 0.41712962962962963 | 49.932 |
| 0.41714120370370367 | 49.931 |
| 0.41715277777777776 | 49.934 |
| 0.4171643518518518 | 49.936 |
| 0.41717592592592595 | 49.937 |
| 0.4171875 | 49.938 |
| 0.4171990740740741 | 49.94 |
| 0.4172106481481481 | 49.94 |
| 0.4172222222222222 | 49.939 |
| 0.41723379629629626 | 49.939 |
| 0.4172453703703704 | 49.939 |
| 0.41725694444444444 | 49.939 |
| 0.41726851851851854 | 49.939 |
| 0.4172800925925926 | 49.94 |
| 0.41729166666666667 | 49.938 |
| 0.4173032407407407 | 49.939 |
| 0.41731481481481486 | 49.939 |
| 0.4173263888888889 | 49.94 |
| 0.417337962962963 | 49.943 |
| 0.41734953703703703 | 49.942 |